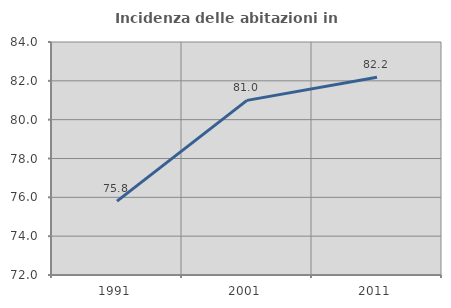
| Category | Incidenza delle abitazioni in proprietà  |
|---|---|
| 1991.0 | 75.805 |
| 2001.0 | 80.995 |
| 2011.0 | 82.185 |